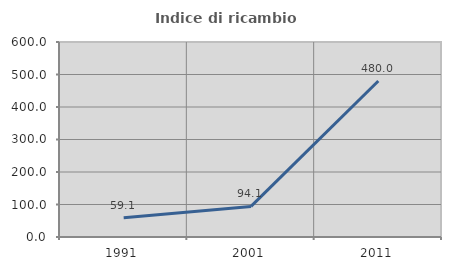
| Category | Indice di ricambio occupazionale  |
|---|---|
| 1991.0 | 59.091 |
| 2001.0 | 94.118 |
| 2011.0 | 480 |